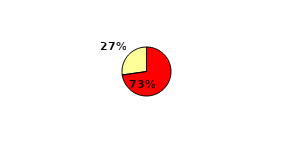
| Category | BAŞ. |
|---|---|
|  | 72.727 |
|  | 27.273 |